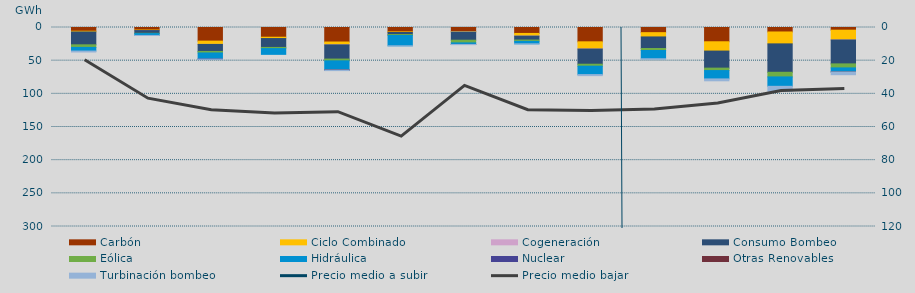
| Category | Carbón | Ciclo Combinado | Cogeneración | Consumo Bombeo | Eólica | Hidráulica | Nuclear | Otras Renovables | Turbinación bombeo |
|---|---|---|---|---|---|---|---|---|---|
| 0 | 5601.6 | 1130.8 | 0 | 19369.2 | 3910.4 | 5534.9 | 0 | 0 | 1362.4 |
| 1 | 3825.2 | 805.7 | 1 | 4108.2 | 441.1 | 2792 | 0 | 0 | 67.3 |
| 2 | 20542.2 | 4950.3 | 40.5 | 10583.3 | 2263.7 | 9147 | 197.5 | 0 | 285 |
| 3 | 14664.7 | 1989 | 0 | 13423.2 | 1723.5 | 8686.8 | 0 | 0 | 0 |
| 4 | 21887.7 | 4264.5 | 79.6 | 21354.7 | 2677.3 | 13814.3 | 70 | 3 | 823.8 |
| 5 | 6583.4 | 903.3 | 0 | 3217 | 1397.7 | 15518.8 | 0 | 0 | 135.7 |
| 6 | 6055 | 869.5 | 10.2 | 12220.9 | 4048.2 | 2358.3 | 0 | 9 | 300 |
| 7 | 8959.6 | 3990.4 | 71.2 | 5885.6 | 1996.4 | 3716.9 | 0 | 0 | 15 |
| 8 | 21604.2 | 10874.5 | 14.4 | 22855.5 | 2969.3 | 12705.9 | 0 | 0 | 1522.5 |
| 9 | 7773.2 | 6440.3 | 0 | 17414.3 | 3010.2 | 12467.7 | 0 | 0 | 569.8 |
| 10 | 21504.5 | 14043.2 | 0 | 25706.9 | 3674.1 | 12576.8 | 0 | 0 | 2844.7 |
| 11 | 6741.5 | 17945.7 | 0 | 42823.3 | 6982 | 14174.9 | 0 | 0 | 7355.5 |
| 12 | 4042.8 | 14771.1 | 31.2 | 36027.7 | 6028.8 | 6115.8 | 0 | 35 | 4115.2 |